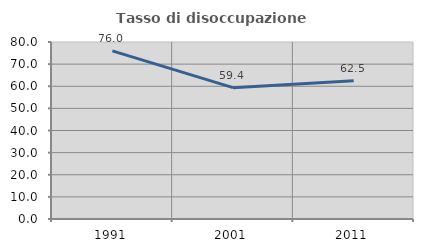
| Category | Tasso di disoccupazione giovanile  |
|---|---|
| 1991.0 | 75.962 |
| 2001.0 | 59.375 |
| 2011.0 | 62.5 |